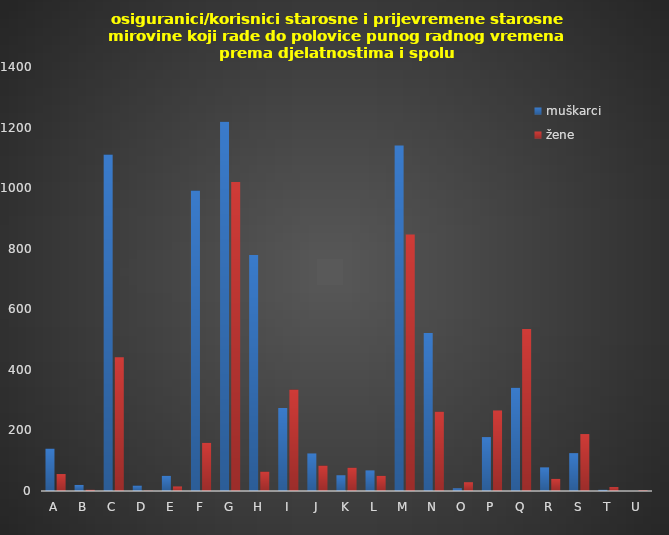
| Category | muškarci | žene |
|---|---|---|
| A | 140 | 56 |
| B | 20 | 4 |
| C | 1111 | 442 |
| D | 18 | 1 |
| E | 50 | 15 |
| F | 992 | 159 |
| G | 1219 | 1020 |
| H | 779 | 64 |
| I | 274 | 335 |
| J | 124 | 84 |
| K | 52 | 77 |
| L | 68 | 50 |
| M | 1141 | 847 |
| N | 522 | 262 |
| O | 9 | 29 |
| P | 178 | 266 |
| Q | 341 | 535 |
| R | 78 | 40 |
| S | 125 | 188 |
| T | 4 | 13 |
| U | 0 | 2 |